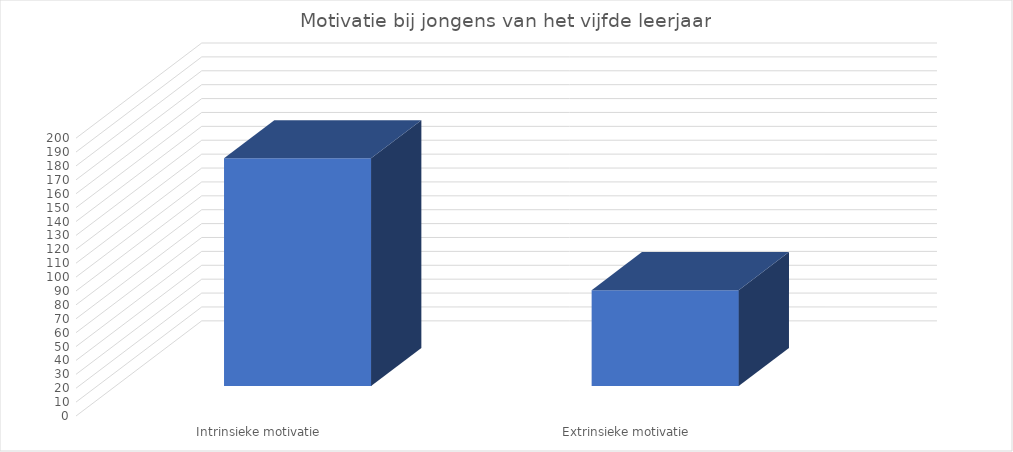
| Category | Series 0 |
|---|---|
| Intrinsieke motivatie | 164 |
| Extrinsieke motivatie | 69 |